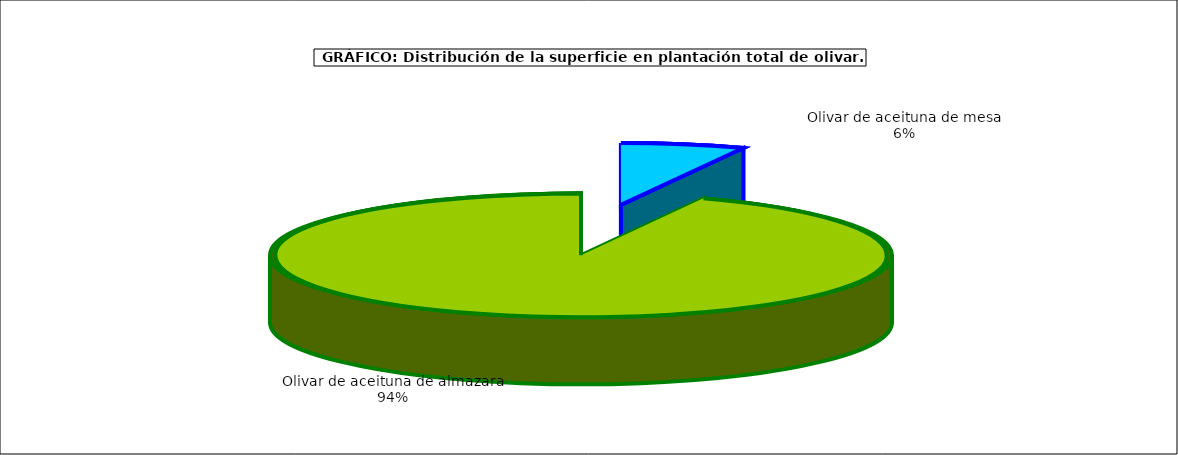
| Category | Series 0 |
|---|---|
| Olivar de aceituna de mesa | 165980 |
| Olivar de aceituna de almazara | 2413021 |